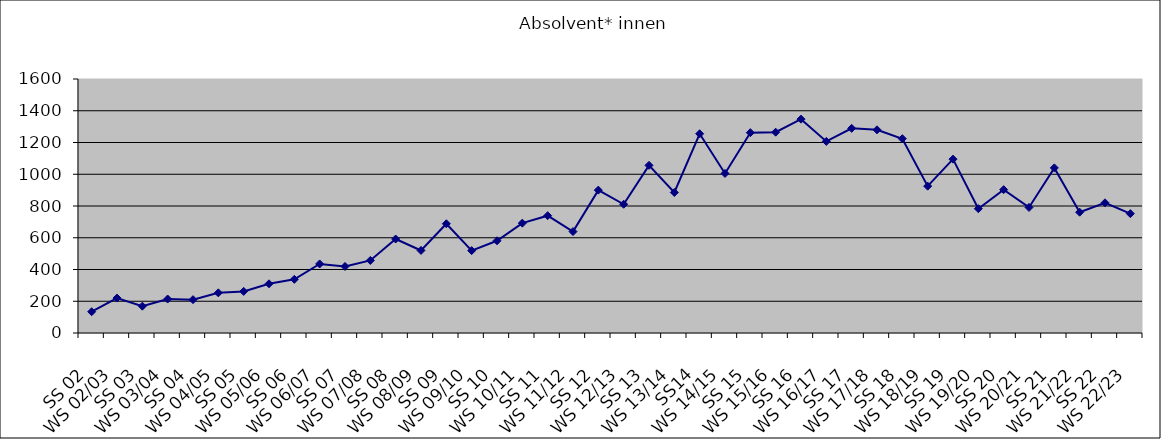
| Category | Absolvent* innen |
|---|---|
| SS 02 | 134 |
| WS 02/03 | 220 |
| SS 03 | 169 |
| WS 03/04 | 214 |
| SS 04 | 210 |
| WS 04/05 | 253 |
| SS 05 | 262 |
| WS 05/06 | 310 |
| SS 06 | 338 |
| WS 06/07 | 435 |
| SS 07 | 419 |
| WS 07/08 | 457 |
| SS 08 | 592 |
| WS 08/09 | 520 |
| SS 09 | 688 |
| WS 09/10 | 519 |
| SS 10 | 581 |
| WS 10/11 | 692 |
| SS 11 | 739 |
| WS 11/12 | 639 |
| SS 12 | 900 |
| WS 12/13 | 811 |
| SS 13 | 1056 |
| WS 13/14 | 885 |
| SS14 | 1255 |
| WS 14/15 | 1005 |
| SS 15 | 1262 |
| WS 15/16 | 1265 |
| SS 16 | 1347 |
| WS 16/17 | 1207 |
| SS 17 | 1289 |
| WS 17/18 | 1280 |
| SS 18 | 1224 |
| WS 18/19 | 925 |
| SS 19 | 1095 |
| WS 19/20 | 783 |
| SS 20 | 903 |
| WS 20/21 | 791 |
| SS 21 | 1040 |
| WS 21/22 | 761 |
| SS 22 | 820 |
| WS 22/23 | 752 |